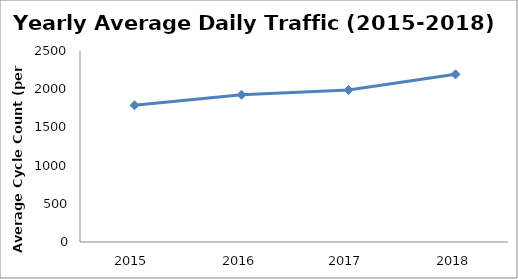
| Category | Series 0 |
|---|---|
| 2015.0 | 1789.753 |
| 2016.0 | 1927.183 |
| 2017.0 | 1988.937 |
| 2018.0 | 2194.384 |